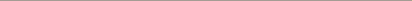
| Category | Series 0 |
|---|---|
| vrlo lako | 0 |
| lako | 5 |
| ni lako, ni teško | 10 |
| teško | 5 |
| vrlo teško ili nemoguće | 1 |